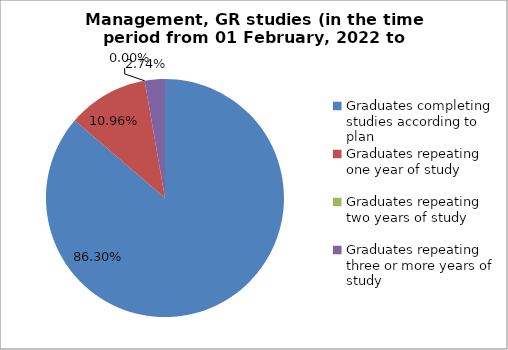
| Category | Series 0 |
|---|---|
| Graduates completing studies according to plan | 86.301 |
| Graduates repeating one year of study | 10.959 |
| Graduates repeating two years of study | 0 |
| Graduates repeating three or more years of study | 2.74 |